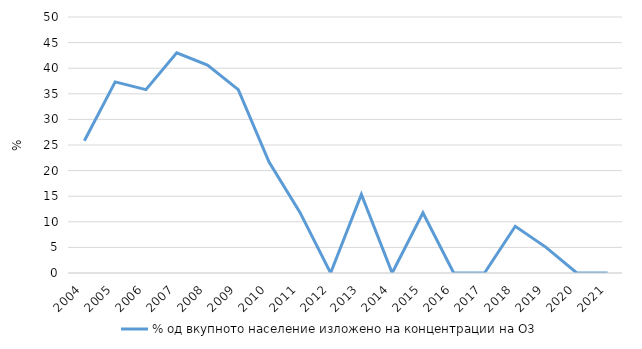
| Category | % од вкупното население изложено на концентрации на O3 |
|---|---|
| 2004.0 | 25.833 |
| 2005.0 | 37.327 |
| 2006.0 | 35.815 |
| 2007.0 | 43.017 |
| 2008.0 | 40.611 |
| 2009.0 | 35.815 |
| 2010.0 | 21.685 |
| 2011.0 | 11.885 |
| 2012.0 | 0 |
| 2013.0 | 15.349 |
| 2014.0 | 0 |
| 2015.0 | 11.744 |
| 2016.0 | 0 |
| 2017.0 | 0 |
| 2018.0 | 9.123 |
| 2019.0 | 5.006 |
| 2020.0 | 0 |
| 2021.0 | 0 |